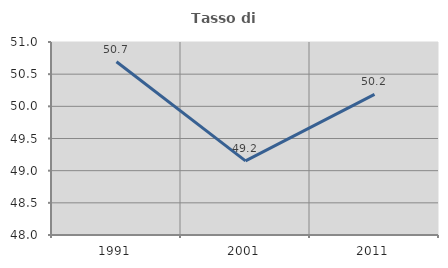
| Category | Tasso di occupazione   |
|---|---|
| 1991.0 | 50.693 |
| 2001.0 | 49.152 |
| 2011.0 | 50.186 |